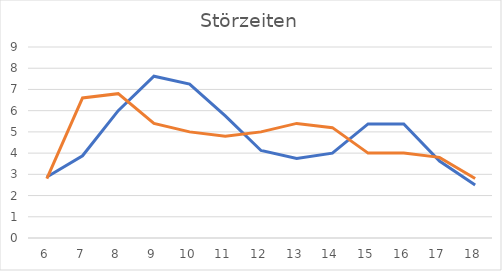
| Category | Leistung | Störung |
|---|---|---|
| 6.0 | 2.875 | 2.8 |
| 7.0 | 3.875 | 6.6 |
| 8.0 | 6 | 6.8 |
| 9.0 | 7.625 | 5.4 |
| 10.0 | 7.25 | 5 |
| 11.0 | 5.75 | 4.8 |
| 12.0 | 4.125 | 5 |
| 13.0 | 3.75 | 5.4 |
| 14.0 | 4 | 5.2 |
| 15.0 | 5.375 | 4 |
| 16.0 | 5.375 | 4 |
| 17.0 | 3.625 | 3.8 |
| 18.0 | 2.5 | 2.8 |